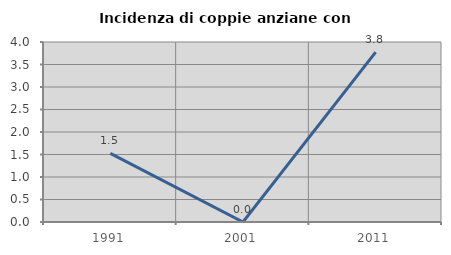
| Category | Incidenza di coppie anziane con figli |
|---|---|
| 1991.0 | 1.527 |
| 2001.0 | 0 |
| 2011.0 | 3.774 |